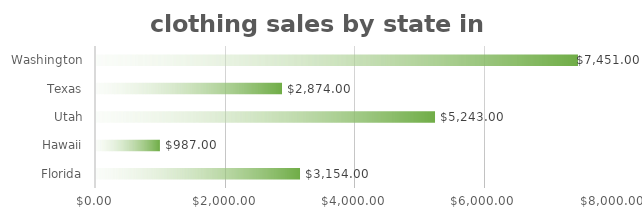
| Category | Total sales |
|---|---|
| Florida | 3154 |
| Hawaii | 987 |
| Utah | 5243 |
| Texas | 2874 |
| Washington | 7451 |